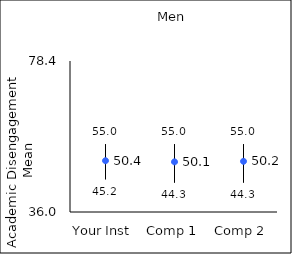
| Category | 25th percentile | 75th percentile | Mean |
|---|---|---|---|
| Your Inst | 45.2 | 55 | 50.4 |
| Comp 1 | 44.3 | 55 | 50.08 |
| Comp 2 | 44.3 | 55 | 50.23 |